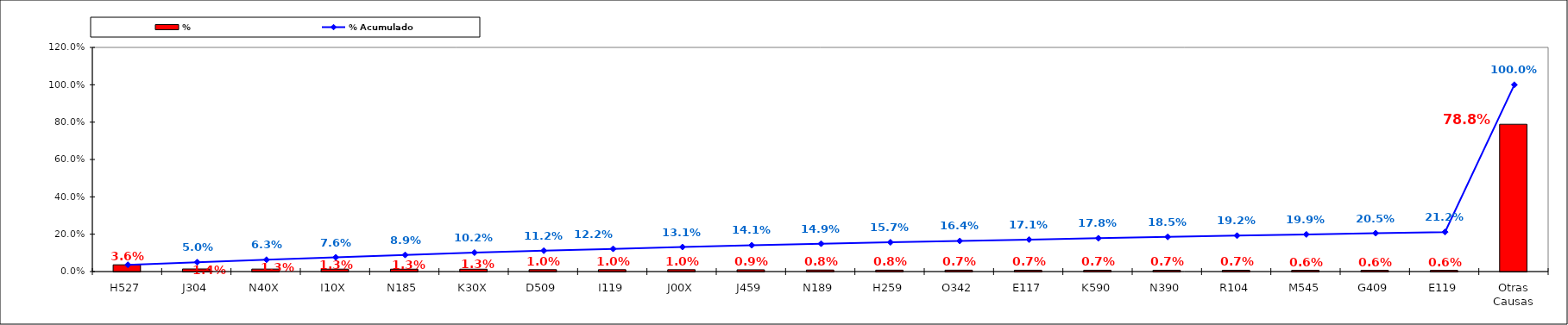
| Category | % |
|---|---|
| H527 | 0.036 |
| J304 | 0.014 |
| N40X | 0.013 |
| I10X | 0.013 |
| N185 | 0.013 |
| K30X | 0.013 |
| D509 | 0.01 |
| I119 | 0.01 |
| J00X | 0.01 |
| J459 | 0.009 |
| N189 | 0.008 |
| H259 | 0.008 |
| O342 | 0.007 |
| E117 | 0.007 |
| K590 | 0.007 |
| N390 | 0.007 |
| R104 | 0.007 |
| M545 | 0.006 |
| G409 | 0.006 |
| E119 | 0.006 |
| Otras Causas | 0.788 |